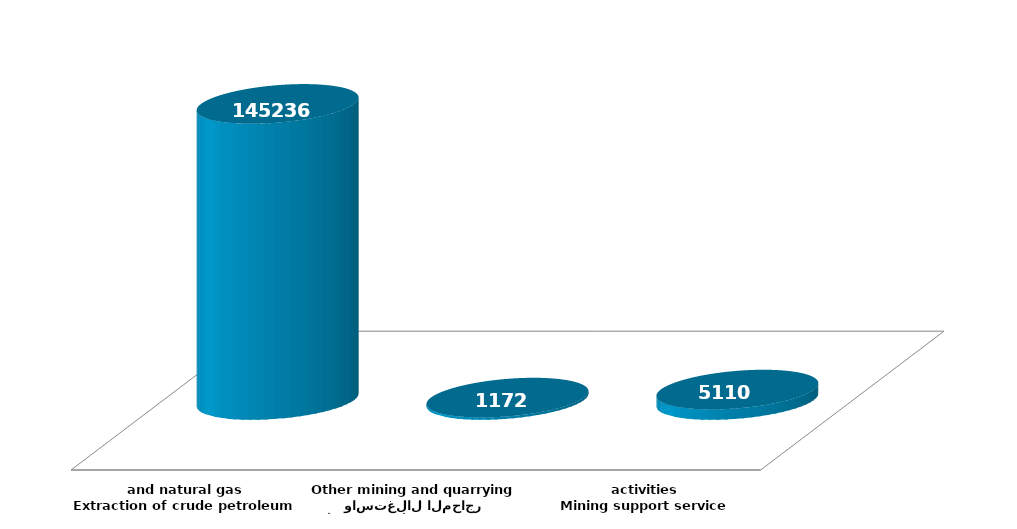
| Category | Series 1 |
|---|---|
| استخراج النفط الخام والغاز الطبيعي
Extraction of crude petroleum and natural gas | 145235994 |
| الأنشطة الأخرى للتعدين واستغلال المحاجر
Other mining and quarrying | 1172228 |
| انشطة خدمات دعم التعدين
Mining support service activities | 5110313 |